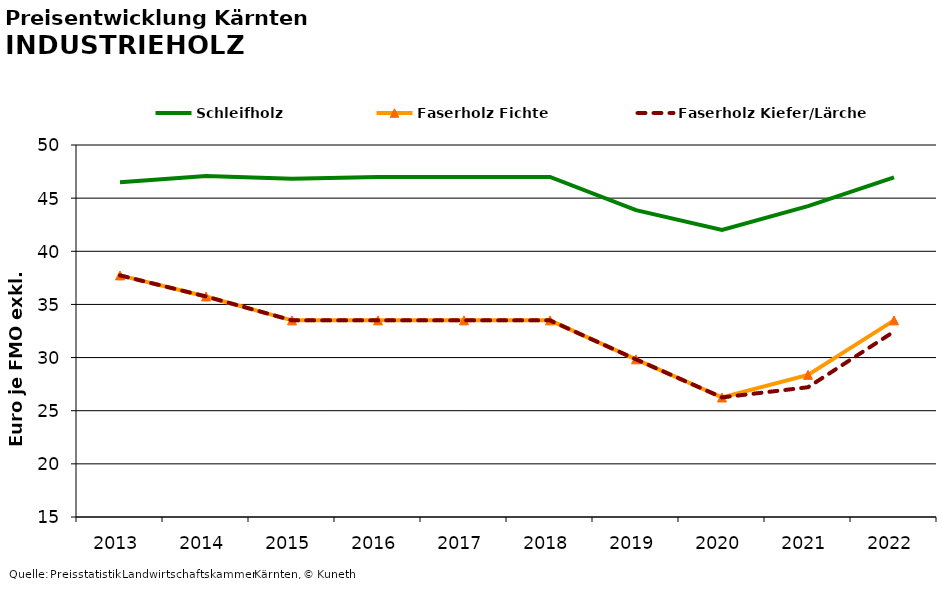
| Category | Schleifholz | Faserholz Fichte | Faserholz Kiefer/Lärche |
|---|---|---|---|
| 2013.0 | 46.5 | 37.729 | 37.729 |
| 2014.0 | 47.083 | 35.75 | 35.75 |
| 2015.0 | 46.833 | 33.5 | 33.5 |
| 2016.0 | 47 | 33.5 | 33.5 |
| 2017.0 | 47 | 33.5 | 33.5 |
| 2018.0 | 47 | 33.5 | 33.5 |
| 2019.0 | 43.875 | 29.833 | 29.833 |
| 2020.0 | 42 | 26.25 | 26.25 |
| 2021.0 | 44.25 | 28.375 | 27.208 |
| 2022.0 | 46.944 | 33.5 | 32.444 |